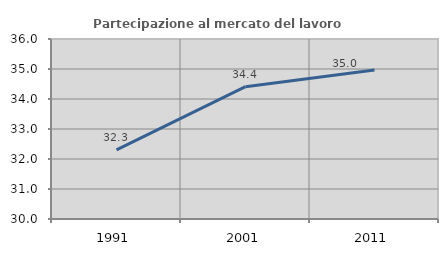
| Category | Partecipazione al mercato del lavoro  femminile |
|---|---|
| 1991.0 | 32.306 |
| 2001.0 | 34.411 |
| 2011.0 | 34.965 |